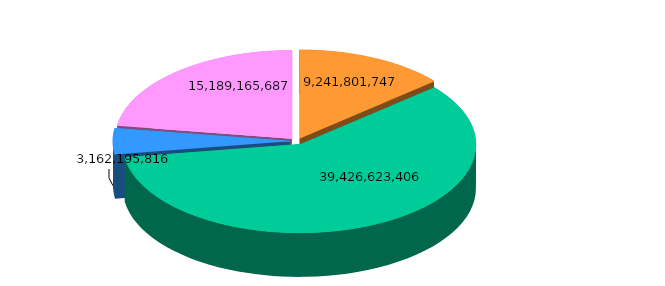
| Category | Series 0 |
|---|---|
| Gobierno | 9241801746.69 |
| Desarrollo Social | 39426623406.11 |
| Desarrollo Económico  | 3162195816.2 |
| Otras no Clasificadas en Funciones Anteriores | 15189165687 |